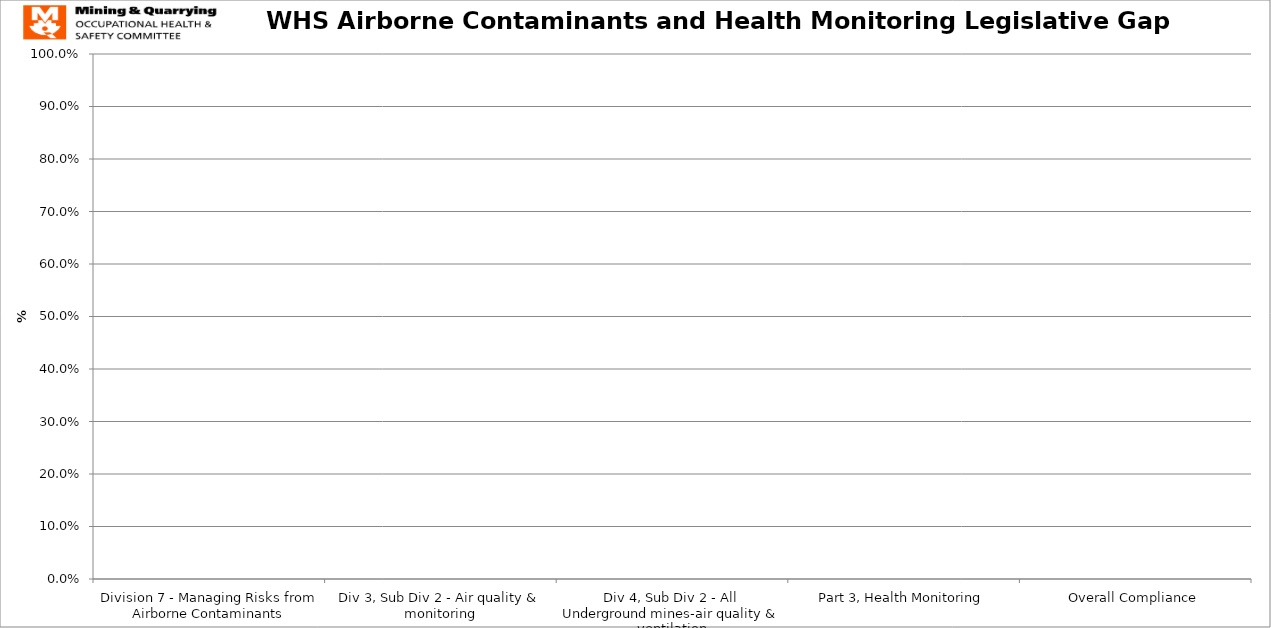
| Category | Series 0 |
|---|---|
| Division 7 - Managing Risks from Airborne Contaminants | 0 |
| Div 3, Sub Div 2 - Air quality & monitoring | 0 |
| Div 4, Sub Div 2 - All Underground mines-air quality & ventilation | 0 |
| Part 3, Health Monitoring | 0 |
| Overall Compliance | 0 |